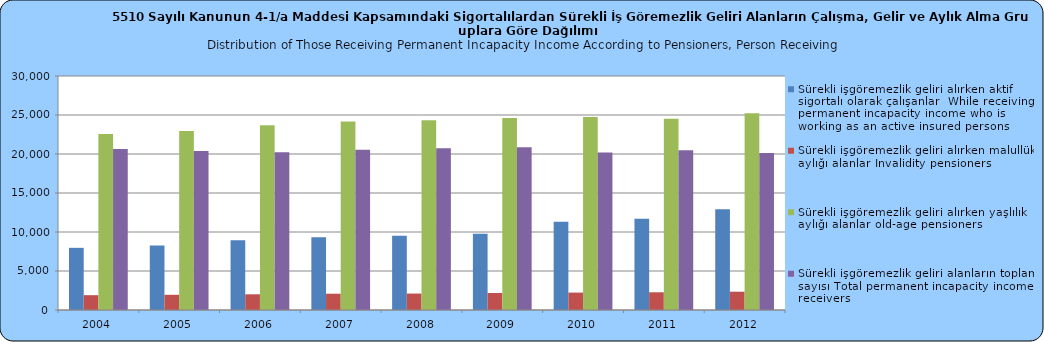
| Category | Sürekli işgöremezlik geliri alırken aktif sigortalı olarak çalışanlar  While receiving permanent incapacity income who is working as an active insured persons | Sürekli işgöremezlik geliri alırken malullük aylığı alanlar Invalidity pensioners           | Sürekli işgöremezlik geliri alırken yaşlılık aylığı alanlar old-age pensioners | Sürekli işgöremezlik geliri alanların toplam sayısı Total permanent incapacity income receivers |
|---|---|---|---|---|
| 2004.0 | 7970 | 1902 | 22559 | 20632 |
| 2005.0 | 8284 | 1951 | 22958 | 20391 |
| 2006.0 | 8938 | 2015 | 23693 | 20211 |
| 2007.0 | 9317 | 2087 | 24164 | 20537 |
| 2008.0 | 9520 | 2109 | 24315 | 20724 |
| 2009.0 | 9767 | 2183 | 24615 | 20857 |
| 2010.0 | 11304 | 2233 | 24757 | 20202 |
| 2011.0 | 11690 | 2273 | 24521 | 20482 |
| 2012.0 | 12904 | 2346 | 25226 | 20136 |